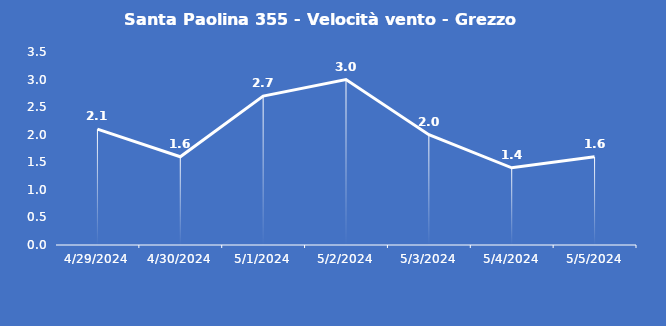
| Category | Santa Paolina 355 - Velocità vento - Grezzo (m/s) |
|---|---|
| 4/29/24 | 2.1 |
| 4/30/24 | 1.6 |
| 5/1/24 | 2.7 |
| 5/2/24 | 3 |
| 5/3/24 | 2 |
| 5/4/24 | 1.4 |
| 5/5/24 | 1.6 |